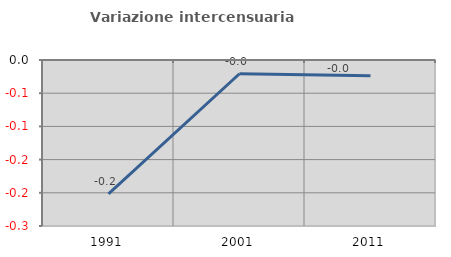
| Category | Variazione intercensuaria annua |
|---|---|
| 1991.0 | -0.202 |
| 2001.0 | -0.021 |
| 2011.0 | -0.024 |